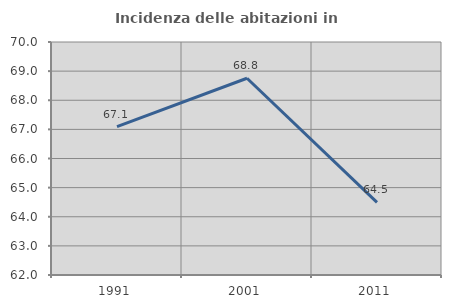
| Category | Incidenza delle abitazioni in proprietà  |
|---|---|
| 1991.0 | 67.091 |
| 2001.0 | 68.755 |
| 2011.0 | 64.491 |